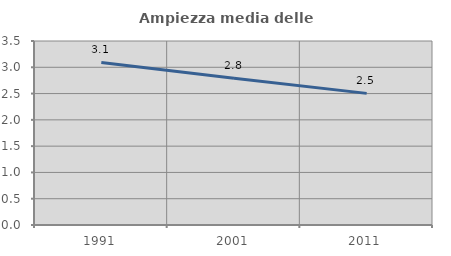
| Category | Ampiezza media delle famiglie |
|---|---|
| 1991.0 | 3.093 |
| 2001.0 | 2.792 |
| 2011.0 | 2.504 |